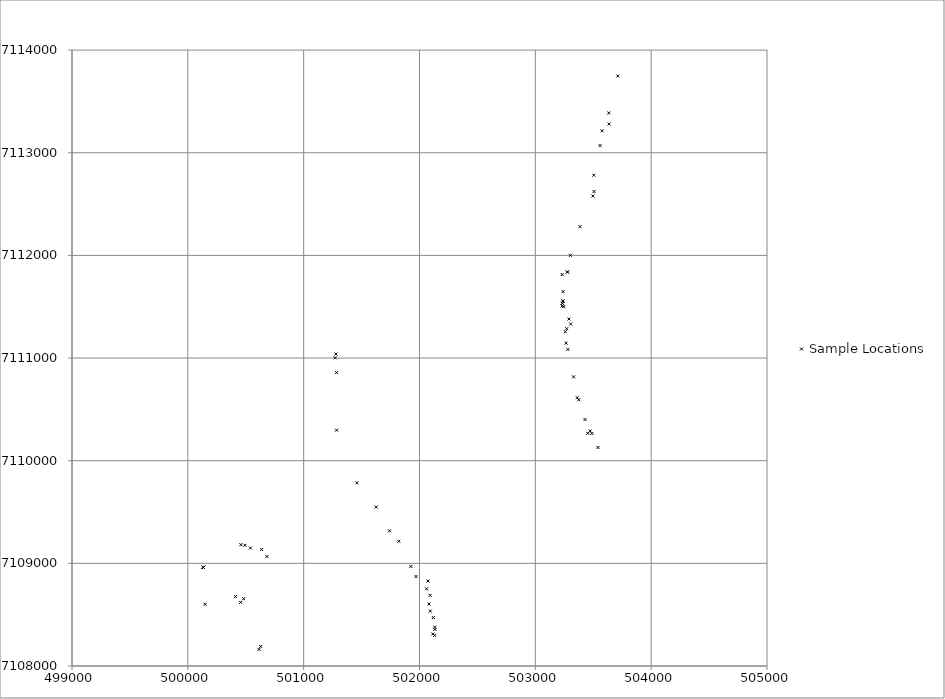
| Category | Sample Locations |
|---|---|
| 502131.0 | 7108298 |
| 502115.0 | 7108312 |
| 502133.0 | 7108356 |
| 502131.0 | 7108380 |
| 502119.0 | 7108472 |
| 502093.0 | 7108535 |
| 502082.0 | 7108604 |
| 502092.0 | 7108688 |
| 500134.0 | 7108961 |
| 500134.0 | 7108961 |
| 500134.0 | 7108961 |
| 500134.0 | 7108961 |
| 500134.0 | 7108961 |
| 500134.0 | 7108961 |
| 500412.0 | 7108677 |
| 500456.0 | 7108620 |
| 500629.0 | 7108191 |
| 500614.0 | 7108162 |
| 500682.0 | 7109066 |
| 500637.0 | 7109135 |
| 500540.0 | 7109149 |
| 500493.0 | 7109176 |
| 500458.0 | 7109182 |
| 502061.0 | 7108752 |
| 502073.0 | 7108828 |
| 501970.0 | 7108872 |
| 501925.0 | 7108970 |
| 501821.0 | 7109215 |
| 501741.0 | 7109317 |
| 501626.0 | 7109549 |
| 501460.0 | 7109785 |
| 501284.0 | 7110297 |
| 501284.0 | 7110858 |
| 501272.0 | 7111003 |
| 501279.0 | 7111039 |
| 503265.0 | 7111145 |
| 503330.0 | 7110817 |
| 503375.0 | 7110594 |
| 503429.0 | 7110401 |
| 503473.0 | 7110290 |
| 503488.0 | 7110265 |
| 503453.0 | 7110267 |
| 503541.0 | 7110129 |
| 503303.0 | 7112001 |
| 503385.0 | 7112280 |
| 503497.0 | 7112578 |
| 503507.0 | 7112622 |
| 503504.0 | 7112781 |
| 503559.0 | 7113070 |
| 503576.0 | 7113214 |
| 503637.0 | 7113280 |
| 503634.0 | 7113388 |
| 503712.0 | 7113748 |
| 503277.0 | 7111838 |
| 503240.0 | 7111647 |
| 503290.0 | 7111380 |
| 503271.0 | 7111286 |
| 503305.0 | 7111332 |
| 503234.0 | 7111533 |
| 503238.0 | 7111556 |
| 500150.0 | 7108601 |
| 500482.0 | 7108656 |
| 503232.0 | 7111813 |
| 503259.0 | 7111257 |
| 503281.0 | 7111084 |
| 503361.0 | 7110614 |
| 503231.0 | 7111508 |
| 503246.0 | 7111501 |
| 503277.0 | 7111838 |
| 503234.0 | 7111533 |
| 503238.0 | 7111556 |